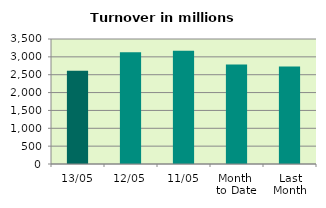
| Category | Series 0 |
|---|---|
| 13/05 | 2611.23 |
| 12/05 | 3130.7 |
| 11/05 | 3171.567 |
| Month 
to Date | 2784.023 |
| Last
Month | 2727.753 |